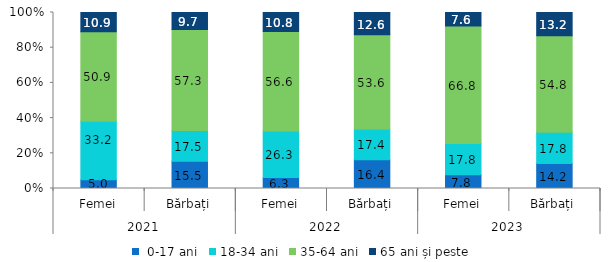
| Category |  0-17 ani | 18-34 ani | 35-64 ani | 65 ani și peste |
|---|---|---|---|---|
| 0 | 5 | 33.2 | 50.9 | 10.9 |
| 1 | 15.5 | 17.5 | 57.3 | 9.7 |
| 2 | 6.3 | 26.3 | 56.6 | 10.8 |
| 3 | 16.4 | 17.4 | 53.6 | 12.6 |
| 4 | 7.8 | 17.8 | 66.8 | 7.6 |
| 5 | 14.2 | 17.8 | 54.8 | 13.2 |